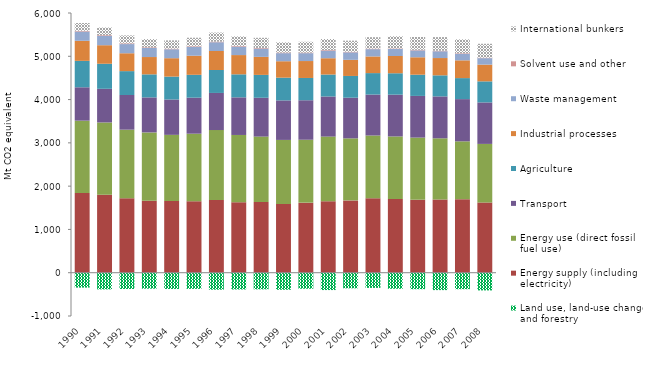
| Category | Land use, land-use change and forestry | Energy supply (including electricity) | Energy use (direct fossil fuel use) | Transport | Agriculture | Industrial processes | Waste management | Solvent use and other | International bunkers |
|---|---|---|---|---|---|---|---|---|---|
| 1990 | -344.614 | 1842.167 | 1670.227 | 771.485 | 610.46 | 463.232 | 214.263 | 16.963 | 179.754 |
| 1991 | -384.86 | 1803.026 | 1668.098 | 777.733 | 578.62 | 428.271 | 215.086 | 16.453 | 177.409 |
| 1992 | -375.321 | 1720.905 | 1583.31 | 801.857 | 551.045 | 412.958 | 211.895 | 15.981 | 184.081 |
| 1993 | -368.418 | 1660.191 | 1580.848 | 809.141 | 532.412 | 400.135 | 208.83 | 15.522 | 191.135 |
| 1994 | -375.213 | 1653.98 | 1531.122 | 816.921 | 528.497 | 425.318 | 206.643 | 14.228 | 191.145 |
| 1995 | -373.424 | 1653.231 | 1558.307 | 832.359 | 528.366 | 440.874 | 204.506 | 14.318 | 196.967 |
| 1996 | -391.425 | 1681.264 | 1614.62 | 857.234 | 530.53 | 439.049 | 201.812 | 14.392 | 208.499 |
| 1997 | -386.428 | 1625.587 | 1556.684 | 869.041 | 531.779 | 444.908 | 195.943 | 14.401 | 221.237 |
| 1998 | -383.927 | 1636.113 | 1509.001 | 896.524 | 528.617 | 416.259 | 191.574 | 14.369 | 234.685 |
| 1999 | -393.079 | 1589.018 | 1478.723 | 913.077 | 525.293 | 379.797 | 186.283 | 13.981 | 236.588 |
| 2000 | -369.737 | 1618.469 | 1453.429 | 912.415 | 514.738 | 391.179 | 181.798 | 13.793 | 249.356 |
| 2001 | -400.723 | 1652.49 | 1492.652 | 925.975 | 507.377 | 376.906 | 176.077 | 13.653 | 254.663 |
| 2002 | -360.437 | 1671.05 | 1432.86 | 938.951 | 502.899 | 372.269 | 173.654 | 13.236 | 256.335 |
| 2003 | -350.844 | 1720.172 | 1449.635 | 945.719 | 496.001 | 384.982 | 168.163 | 12.724 | 263.967 |
| 2004 | -370.736 | 1702.506 | 1445.599 | 965.221 | 494.7 | 398.305 | 162.184 | 12.691 | 281.676 |
| 2005 | -380.546 | 1686.507 | 1435.04 | 962.994 | 489.978 | 402.769 | 158.686 | 12.78 | 296.636 |
| 2006 | -401.781 | 1691.359 | 1413.926 | 968.083 | 486.591 | 399.558 | 156.534 | 12.839 | 314.279 |
| 2007 | -380.549 | 1698.77 | 1336.265 | 975.397 | 485.482 | 410.61 | 152.302 | 12.502 | 319.992 |
| 2008 | -408.753 | 1621.229 | 1354.368 | 958.501 | 486.809 | 386.775 | 149.36 | 12.011 | 319.875 |